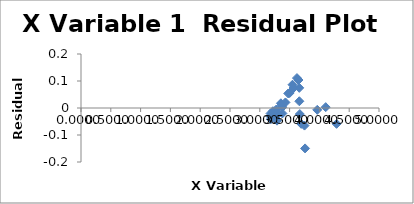
| Category | Series 0 |
|---|---|
| 4.288361027472952 | -0.059 |
| 4.105918740286373 | 0.003 |
| 3.963976609996606 | -0.007 |
| 3.7596678446896306 | -0.15 |
| 3.750199727829182 | -0.065 |
| 3.6946929263314843 | -0.059 |
| 3.6712654329471586 | -0.022 |
| 3.663229634532868 | 0.025 |
| 3.6620964454179235 | 0.075 |
| 3.649334858712142 | 0.104 |
| 3.6232492903979003 | 0.111 |
| 3.566319621524811 | 0.074 |
| 3.5491259267581112 | 0.086 |
| 3.501196242027089 | 0.056 |
| 3.476976465759527 | 0.054 |
| 3.4302363534115106 | 0.021 |
| 3.379124146070392 | -0.02 |
| 3.3778524190067545 | 0.003 |
| 3.3654879848909 | 0.01 |
| 3.353916230920363 | 0.017 |
| 3.288696260590256 | -0.047 |
| 3.288249225571986 | -0.027 |
| 3.2823955047425257 | -0.016 |
| 3.2757719001649312 | -0.006 |
| 3.256958152560932 | -0.013 |
| 3.2350231594952237 | -0.024 |
| 3.2268575702887237 | -0.019 |
| 3.220108088040055 | -0.012 |
| 3.185825359612962 | -0.042 |
| 3.182129214052998 | -0.032 |
| 3.179838928023187 | -0.02 |